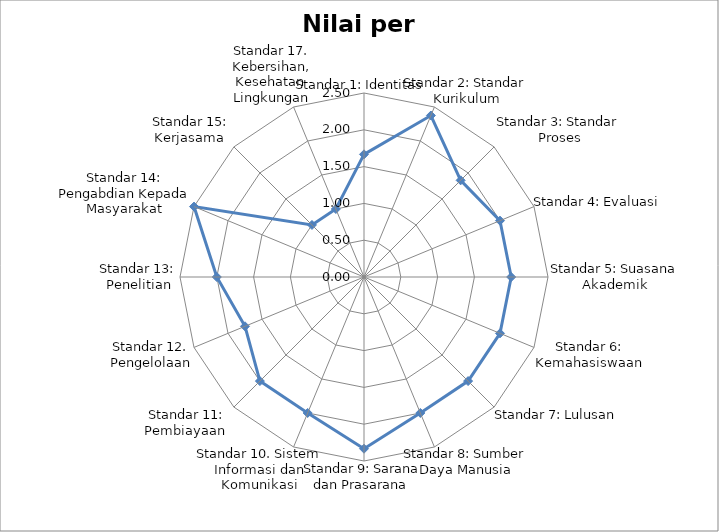
| Category | Nilai per standar |
|---|---|
| Standar 1: Identitas | 1.667 |
| Standar 2: Standar Kurikulum | 2.375 |
| Standar 3: Standar Proses | 1.857 |
| Standar 4: Evaluasi | 2 |
| Standar 5: Suasana Akademik | 2 |
| Standar 6: Kemahasiswaan | 2 |
| Standar 7: Lulusan  | 2 |
| Standar 8: Sumber Daya Manusia | 2 |
| Standar 9: Sarana dan Prasarana  | 2.333 |
| Standar 10. Sistem Informasi dan Komunikasi | 2 |
| Standar 11: Pembiayaan  | 2 |
| Standar 12. Pengelolaan | 1.75 |
| Standar 13: Penelitian | 2 |
| Standar 14: Pengabdian Kepada Masyarakat | 2.5 |
| Standar 15: Kerjasama  | 1 |
| Standar 17. Kebersihan, Kesehatan  Lingkungan | 1 |